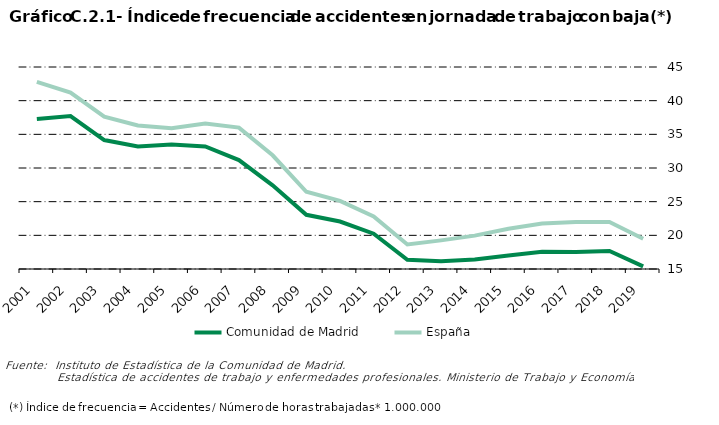
| Category | Comunidad de Madrid | España |
|---|---|---|
| 2001.0 | 37.291 | 42.8 |
| 2002.0 | 37.712 | 41.206 |
| 2003.0 | 34.147 | 37.623 |
| 2004.0 | 33.21 | 36.316 |
| 2005.0 | 33.504 | 35.912 |
| 2006.0 | 33.2 | 36.6 |
| 2007.0 | 31.174 | 36 |
| 2008.0 | 27.424 | 31.89 |
| 2009.0 | 23.054 | 26.468 |
| 2010.0 | 22.047 | 25.109 |
| 2011.0 | 20.248 | 22.814 |
| 2012.0 | 16.367 | 18.642 |
| 2013.0 | 16.134 | 19.252 |
| 2014.0 | 16.398 | 19.958 |
| 2015.0 | 16.996 | 20.971 |
| 2016.0 | 17.553 | 21.749 |
| 2017.0 | 17.514 | 21.97 |
| 2018.0 | 17.676 | 21.989 |
| 2019.0 | 15.4 | 19.5 |